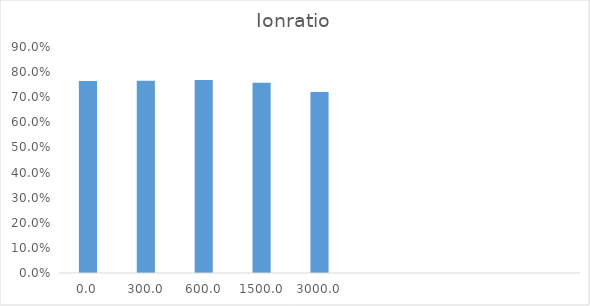
| Category | Series 0 |
|---|---|
| 0.0 | 0.765 |
| 300.0 | 0.766 |
| 600.0 | 0.768 |
| 1500.0 | 0.758 |
| 3000.0 | 0.721 |